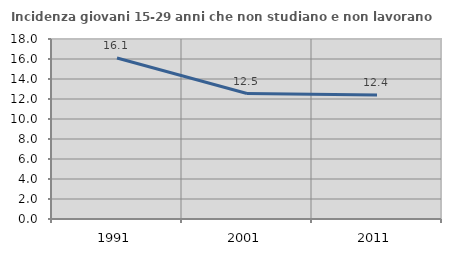
| Category | Incidenza giovani 15-29 anni che non studiano e non lavorano  |
|---|---|
| 1991.0 | 16.105 |
| 2001.0 | 12.55 |
| 2011.0 | 12.405 |